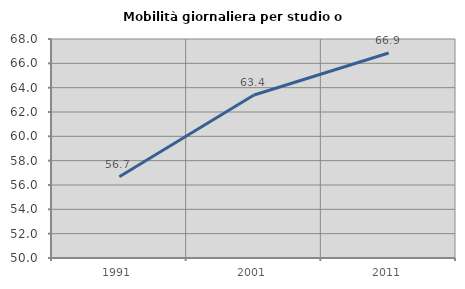
| Category | Mobilità giornaliera per studio o lavoro |
|---|---|
| 1991.0 | 56.683 |
| 2001.0 | 63.397 |
| 2011.0 | 66.853 |